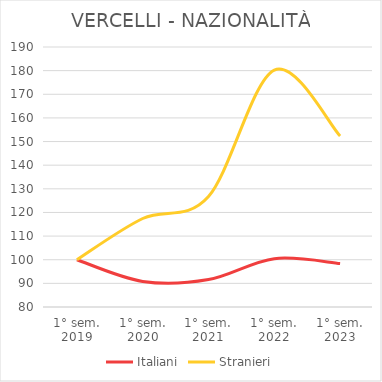
| Category | Italiani | Stranieri |
|---|---|---|
| 1° sem.
2019 | 100 | 100 |
| 1° sem.
2020 | 90.827 | 117.442 |
| 1° sem.
2021 | 91.619 | 126.744 |
| 1° sem.
2022 | 100.453 | 180.233 |
| 1° sem.
2023 | 98.414 | 152.326 |